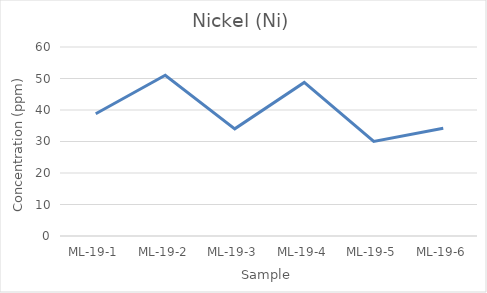
| Category | Series 0 |
|---|---|
| ML-19-1 | 38.823 |
| ML-19-2 | 51.033 |
| ML-19-3 | 34.026 |
| ML-19-4 | 48.766 |
| ML-19-5 | 30.044 |
| ML-19-6 | 34.194 |